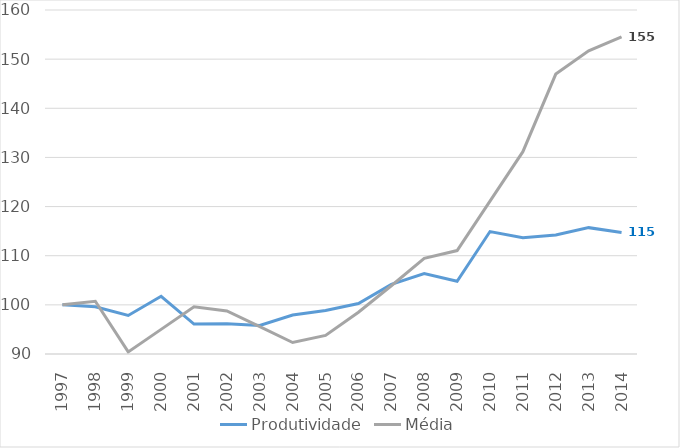
| Category | Produtividade | Média |
|---|---|---|
| 1997.0 | 100 | 100 |
| 1998.0 | 99.593 | 100.729 |
| 1999.0 | 97.836 | 90.425 |
| 2000.0 | 101.751 | 95.012 |
| 2001.0 | 96.086 | 99.598 |
| 2002.0 | 96.166 | 98.749 |
| 2003.0 | 95.813 | 95.581 |
| 2004.0 | 97.918 | 92.343 |
| 2005.0 | 98.868 | 93.779 |
| 2006.0 | 100.273 | 98.503 |
| 2007.0 | 104.152 | 103.884 |
| 2008.0 | 106.365 | 109.463 |
| 2009.0 | 104.803 | 111.044 |
| 2010.0 | 114.918 | 121.106 |
| 2011.0 | 113.649 | 131.168 |
| 2012.0 | 114.226 | 146.962 |
| 2013.0 | 115.712 | 151.68 |
| 2014.0 | 114.734 | 154.551 |